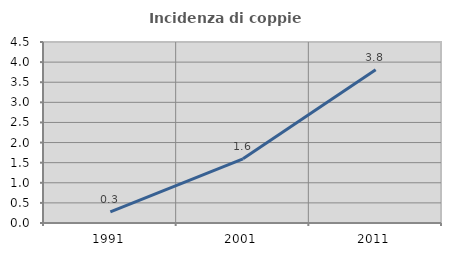
| Category | Incidenza di coppie miste |
|---|---|
| 1991.0 | 0.277 |
| 2001.0 | 1.596 |
| 2011.0 | 3.812 |